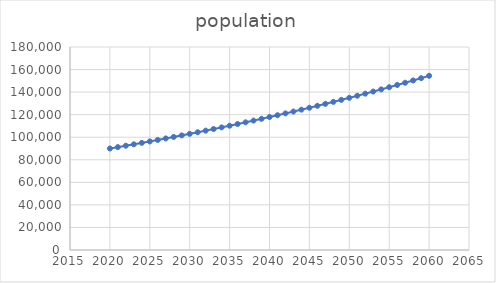
| Category | population |
|---|---|
| 2020.0 | 90000 |
| 2021.0 | 91223.238 |
| 2022.0 | 92463.102 |
| 2023.0 | 93719.818 |
| 2024.0 | 94993.614 |
| 2025.0 | 96284.723 |
| 2026.0 | 97593.381 |
| 2027.0 | 98919.825 |
| 2028.0 | 100264.297 |
| 2029.0 | 101627.043 |
| 2030.0 | 103008.311 |
| 2031.0 | 104408.352 |
| 2032.0 | 105827.422 |
| 2033.0 | 107265.779 |
| 2034.0 | 108723.686 |
| 2035.0 | 110201.408 |
| 2036.0 | 111699.214 |
| 2037.0 | 113217.378 |
| 2038.0 | 114756.176 |
| 2039.0 | 116315.889 |
| 2040.0 | 117896.801 |
| 2041.0 | 119499.199 |
| 2042.0 | 121123.377 |
| 2043.0 | 122769.63 |
| 2044.0 | 124438.258 |
| 2045.0 | 126129.565 |
| 2046.0 | 127843.859 |
| 2047.0 | 129581.454 |
| 2048.0 | 131342.665 |
| 2049.0 | 133127.813 |
| 2050.0 | 134937.225 |
| 2051.0 | 136771.229 |
| 2052.0 | 138630.16 |
| 2053.0 | 140514.357 |
| 2054.0 | 142424.163 |
| 2055.0 | 144359.926 |
| 2056.0 | 146322 |
| 2057.0 | 148310.74 |
| 2058.0 | 150326.511 |
| 2059.0 | 152369.68 |
| 2060.0 | 154440.618 |